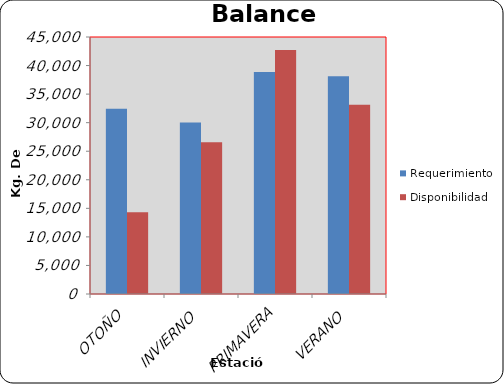
| Category | Requerimientos | Disponibilidad |
|---|---|---|
| OTOÑO | 32418.75 | 14296 |
| INVIERNO | 30015 | 26564 |
| PRIMAVERA | 38879.75 | 42716 |
| VERANO | 38106.25 | 33144 |